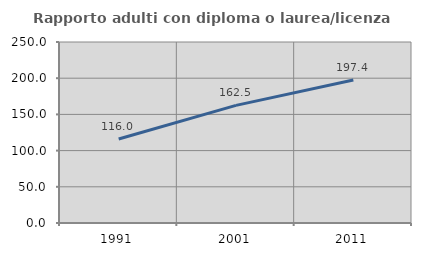
| Category | Rapporto adulti con diploma o laurea/licenza media  |
|---|---|
| 1991.0 | 116.017 |
| 2001.0 | 162.457 |
| 2011.0 | 197.414 |